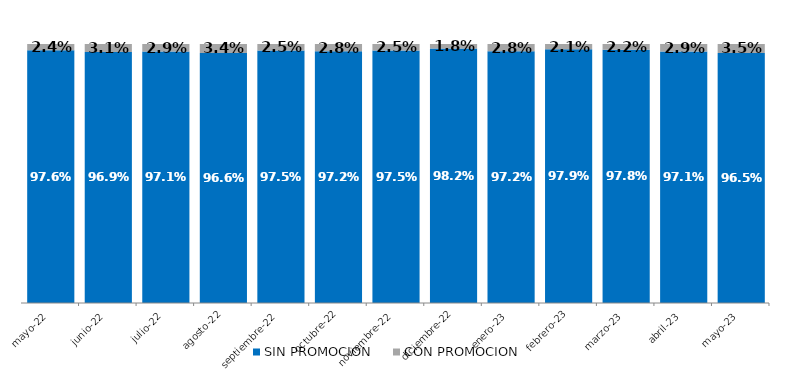
| Category | SIN PROMOCION   | CON PROMOCION   |
|---|---|---|
| 2022-05-01 | 0.976 | 0.024 |
| 2022-06-01 | 0.969 | 0.031 |
| 2022-07-01 | 0.971 | 0.029 |
| 2022-08-01 | 0.966 | 0.034 |
| 2022-09-01 | 0.975 | 0.025 |
| 2022-10-01 | 0.972 | 0.028 |
| 2022-11-01 | 0.975 | 0.025 |
| 2022-12-01 | 0.982 | 0.018 |
| 2023-01-01 | 0.972 | 0.028 |
| 2023-02-01 | 0.979 | 0.021 |
| 2023-03-01 | 0.978 | 0.022 |
| 2023-04-01 | 0.971 | 0.029 |
| 2023-05-01 | 0.965 | 0.035 |